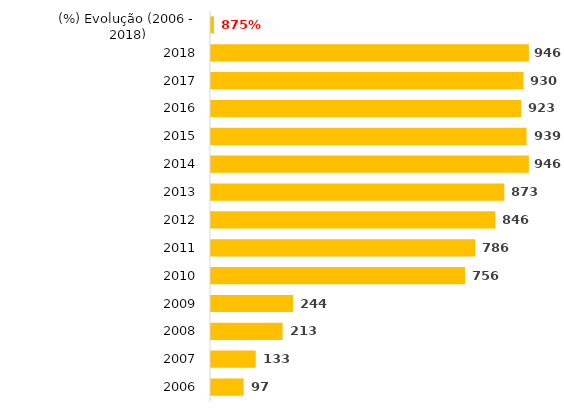
| Category | Téc. Adm. |
|---|---|
| 2006 | 97 |
| 2007 | 133 |
| 2008 | 213 |
| 2009 | 244 |
| 2010 | 756 |
| 2011 | 786 |
| 2012 | 846 |
| 2013 | 873 |
| 2014 | 946 |
| 2015 | 939 |
| 2016 | 923 |
| 2017 | 930 |
| 2018 | 946 |
| (%) Evolução (2006 - 2018) | 8.753 |